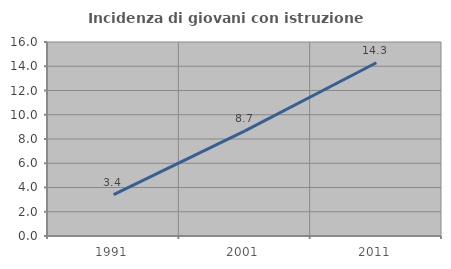
| Category | Incidenza di giovani con istruzione universitaria |
|---|---|
| 1991.0 | 3.413 |
| 2001.0 | 8.671 |
| 2011.0 | 14.286 |